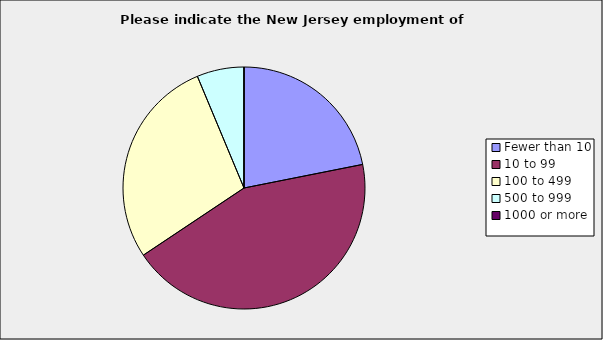
| Category | Series 0 |
|---|---|
| Fewer than 10 | 0.219 |
| 10 to 99 | 0.438 |
| 100 to 499 | 0.281 |
| 500 to 999 | 0.063 |
| 1000 or more | 0 |